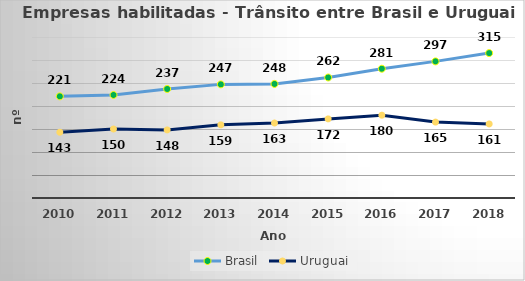
| Category | Brasil | Uruguai |
|---|---|---|
| 2010.0 | 221 | 143 |
| 2011.0 | 224 | 150 |
| 2012.0 | 237 | 148 |
| 2013.0 | 247 | 159 |
| 2014.0 | 248 | 163 |
| 2015.0 | 262 | 172 |
| 2016.0 | 281 | 180 |
| 2017.0 | 297 | 165 |
| 2018.0 | 315 | 161 |